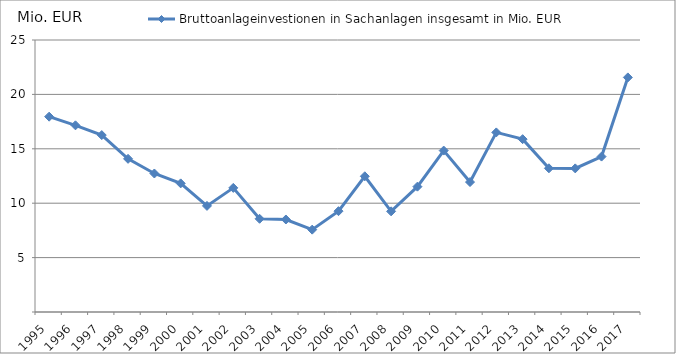
| Category | Bruttoanlageinvestionen in Sachanlagen insgesamt in Mio. EUR |
|---|---|
| 1995.0 | 17.953 |
| 1996.0 | 17.158 |
| 1997.0 | 16.261 |
| 1998.0 | 14.078 |
| 1999.0 | 12.731 |
| 2000.0 | 11.822 |
| 2001.0 | 9.752 |
| 2002.0 | 11.408 |
| 2003.0 | 8.567 |
| 2004.0 | 8.502 |
| 2005.0 | 7.569 |
| 2006.0 | 9.268 |
| 2007.0 | 12.474 |
| 2008.0 | 9.251 |
| 2009.0 | 11.52 |
| 2010.0 | 14.838 |
| 2011.0 | 11.944 |
| 2012.0 | 16.506 |
| 2013.0 | 15.886 |
| 2014.0 | 13.207 |
| 2015.0 | 13.201 |
| 2016.0 | 14.285 |
| 2017.0 | 21.561 |